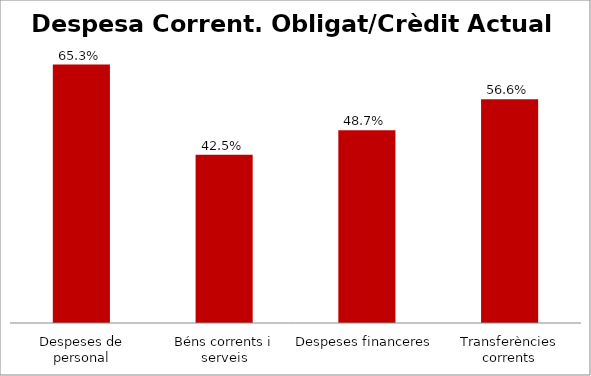
| Category | Series 0 |
|---|---|
| Despeses de personal | 0.653 |
| Béns corrents i serveis | 0.425 |
| Despeses financeres | 0.487 |
| Transferències corrents | 0.566 |